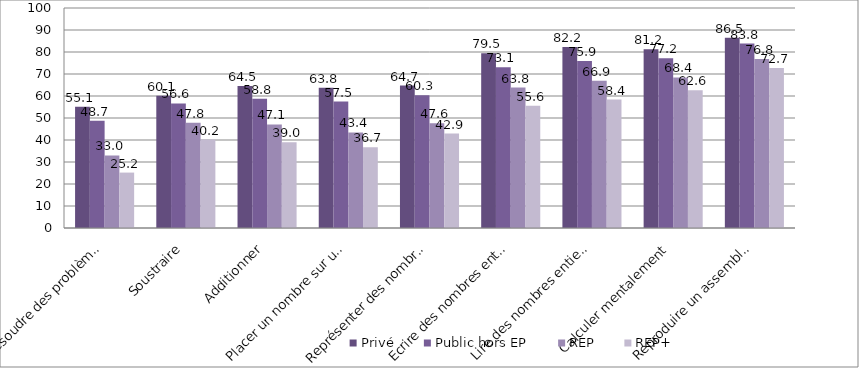
| Category | Privé | Public hors EP | REP | REP+ |
|---|---|---|---|---|
| Résoudre des problèmes | 55.12 | 48.74 | 32.99 | 25.19 |
| Soustraire | 60.09 | 56.63 | 47.83 | 40.2 |
| Additionner | 64.51 | 58.77 | 47.09 | 38.96 |
| Placer un nombre sur une ligne numérique | 63.76 | 57.46 | 43.44 | 36.68 |
| Représenter des nombres entiers | 64.74 | 60.31 | 47.6 | 42.9 |
| Ecrire des nombres entiers | 79.47 | 73.08 | 63.81 | 55.6 |
| Lire des nombres entiers | 82.22 | 75.9 | 66.9 | 58.4 |
| Calculer mentalement | 81.24 | 77.21 | 68.44 | 62.61 |
| Reproduire un assemblage | 86.48 | 83.82 | 76.81 | 72.74 |